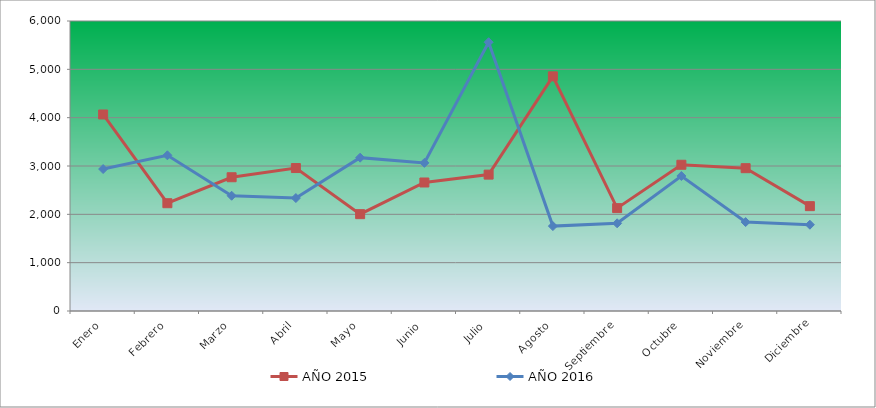
| Category | AÑO 2015 | AÑO 2016 |
|---|---|---|
| Enero | 4066.135 | 2936.925 |
| Febrero | 2230.255 | 3221.399 |
| Marzo | 2767.42 | 2384.608 |
| Abril | 2957.807 | 2336.915 |
| Mayo | 2003.579 | 3172.641 |
| Junio | 2658.627 | 3064.595 |
| Julio | 2821.816 | 5560.349 |
| Agosto | 4854.884 | 1756.364 |
| Septiembre | 2128.261 | 1814.482 |
| Octubre | 3025.694 | 2793.397 |
| Noviembre | 2955.033 | 1839.49 |
| Diciembre | 2169.214 | 1785.049 |